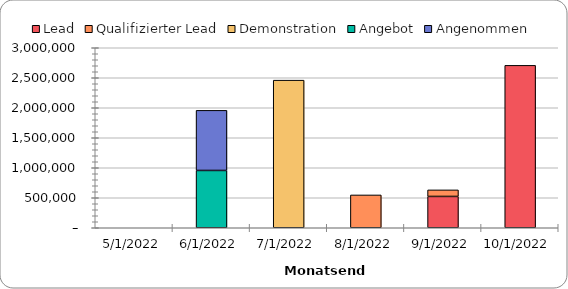
| Category | Lead | Qualifizierter Lead | Demonstration | Angebot | Angenommen |
|---|---|---|---|---|---|
| 10/31/22 | 2707000 | 0 | 0 | 0 | 0 |
| 9/30/22 | 522000 | 109000 | 0 | 0 | 0 |
| 8/31/22 | 0 | 547000 | 0 | 0 | 0 |
| 7/31/22 | 0 | 0 | 2460000 | 0 | 0 |
| 6/30/22 | 0 | 0 | 0 | 955000 | 1002000 |
| 5/31/22 | 0 | 0 | 0 | 0 | 0 |